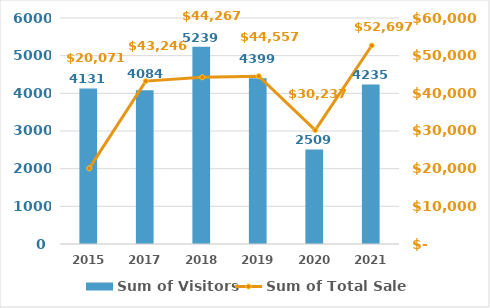
| Category | Sum of Visitors |
|---|---|
| 2015 | 4131 |
| 2017 | 4084 |
| 2018 | 5239 |
| 2019 | 4399 |
| 2020 | 2509 |
| 2021 | 4235 |